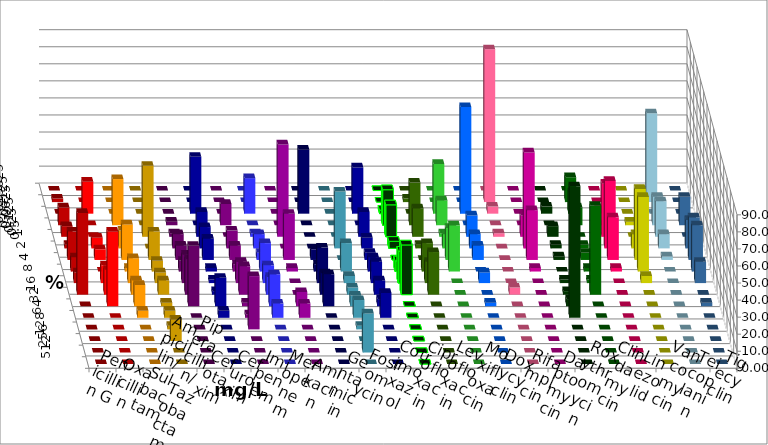
| Category | Penicillin G | Oxacillin | Ampicillin/ Sulbactam | Piperacillin/ Tazobactam | Cefotaxim | Cefuroxim | Imipenem | Meropenem | Amikacin | Gentamicin | Fosfomycin | Cotrimoxazol | Ciprofloxacin | Levofloxacin | Moxifloxacin | Doxycyclin | Rifampicin | Daptomycin | Roxythromycin | Clindamycin | Linezolid | Vancomycin | Teicoplanin | Tigecyclin |
|---|---|---|---|---|---|---|---|---|---|---|---|---|---|---|---|---|---|---|---|---|---|---|---|---|
| 0.015625 | 0 | 0 | 0 | 0 | 0 | 0 | 0 | 0 | 0 | 0 | 0 | 0 | 0 | 0 | 0 | 0 | 0 | 0 | 0 | 0 | 0 | 0 | 0 | 0 |
| 0.03125 | 2.083 | 0 | 0 | 0 | 0 | 0 | 0 | 0 | 0 | 0 | 0 | 0 | 0 | 2.083 | 0 | 0 | 89.583 | 0 | 0 | 14.583 | 0 | 0 | 0 | 52.083 |
| 0.0625 | 0 | 18.75 | 0 | 0 | 0 | 0 | 33.333 | 20.833 | 0 | 37.5 | 0 | 27.083 | 2.083 | 0 | 29.167 | 62.5 | 4.167 | 0 | 4.167 | 12.5 | 2.083 | 0 | 0 | 0 |
| 0.125 | 10.417 | 0 | 27.083 | 0 | 2.083 | 12.5 | 0 | 0 | 0 | 0 | 0 | 0 | 20.833 | 25 | 14.583 | 0 | 0 | 0 | 0 | 10.417 | 0 | 2.083 | 16.667 | 16.667 |
| 0.25 | 6.25 | 0 | 0 | 41.667 | 2.083 | 0 | 14.583 | 2.083 | 54.167 | 0 | 0 | 14.583 | 18.75 | 16.667 | 2.083 | 12.5 | 2.083 | 12.5 | 6.25 | 0 | 31.25 | 0 | 0 | 20.833 |
| 0.5 | 2.083 | 6.25 | 10.417 | 0 | 8.333 | 10.417 | 12.5 | 8.333 | 0 | 0 | 33.333 | 6.25 | 4.167 | 2.083 | 8.333 | 8.333 | 0 | 56.25 | 2.083 | 2.083 | 39.583 | 8.333 | 16.667 | 8.333 |
| 1.0 | 16.667 | 6.25 | 20.833 | 16.667 | 8.333 | 8.333 | 12.5 | 4.167 | 27.083 | 6.25 | 0 | 4.167 | 0 | 0 | 18.75 | 8.333 | 0 | 29.167 | 2.083 | 4.167 | 25 | 41.667 | 25 | 2.083 |
| 2.0 | 8.333 | 0 | 2.083 | 6.25 | 6.25 | 4.167 | 2.083 | 16.667 | 2.083 | 4.167 | 16.667 | 8.333 | 6.25 | 16.667 | 27.083 | 0 | 0 | 2.083 | 0 | 2.083 | 2.083 | 43.75 | 27.083 | 0 |
| 4.0 | 6.25 | 10.417 | 14.583 | 6.25 | 16.667 | 12.5 | 2.083 | 10.417 | 0 | 20.833 | 4.167 | 12.5 | 18.75 | 12.5 | 0 | 6.25 | 0 | 0 | 2.083 | 2.083 | 0 | 4.167 | 12.5 | 0 |
| 8.0 | 47.917 | 14.583 | 8.333 | 8.333 | 20.833 | 16.667 | 2.083 | 10.417 | 0 | 12.5 | 4.167 | 8.333 | 29.167 | 25 | 0 | 0 | 4.167 | 0 | 2.083 | 52.083 | 0 | 0 | 0 | 0 |
| 16.0 | 0 | 43.75 | 12.5 | 2.083 | 35.417 | 2.083 | 16.667 | 18.75 | 8.333 | 18.75 | 6.25 | 4.167 | 0 | 0 | 0 | 2.083 | 0 | 0 | 4.167 | 0 | 0 | 0 | 2.083 | 0 |
| 32.0 | 0 | 0 | 4.167 | 4.167 | 0 | 2.083 | 4.167 | 8.333 | 8.333 | 0 | 10.417 | 14.583 | 0 | 0 | 0 | 0 | 0 | 0 | 77.083 | 0 | 0 | 0 | 0 | 0 |
| 64.0 | 0 | 0 | 0 | 2.083 | 0 | 31.25 | 0 | 0 | 0 | 0 | 2.083 | 0 | 0 | 0 | 0 | 0 | 0 | 0 | 0 | 0 | 0 | 0 | 0 | 0 |
| 128.0 | 0 | 0 | 0 | 12.5 | 0 | 0 | 0 | 0 | 0 | 0 | 0 | 0 | 0 | 0 | 0 | 0 | 0 | 0 | 0 | 0 | 0 | 0 | 0 | 0 |
| 256.0 | 0 | 0 | 0 | 0 | 0 | 0 | 0 | 0 | 0 | 0 | 22.917 | 0 | 0 | 0 | 0 | 0 | 0 | 0 | 0 | 0 | 0 | 0 | 0 | 0 |
| 512.0 | 0 | 0 | 0 | 0 | 0 | 0 | 0 | 0 | 0 | 0 | 0 | 0 | 0 | 0 | 0 | 0 | 0 | 0 | 0 | 0 | 0 | 0 | 0 | 0 |